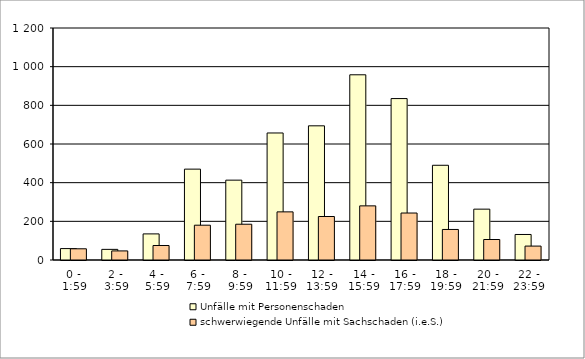
| Category |    Unfälle mit Personenschaden |    schwerwiegende Unfälle mit Sachschaden (i.e.S.)  |
|---|---|---|
| 0 | 59 | 58 |
| 1 | 55 | 47 |
| 2 | 135 | 75 |
| 3 | 470 | 180 |
| 4 | 413 | 185 |
| 5 | 657 | 249 |
| 6 | 694 | 225 |
| 7 | 958 | 280 |
| 8 | 835 | 243 |
| 9 | 490 | 158 |
| 10 | 263 | 106 |
| 11 | 132 | 72 |